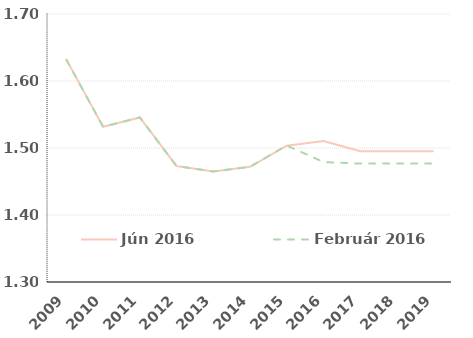
| Category | Jún 2016 | Február 2016 |
|---|---|---|
| 2009.0 | 1.632 | 1.632 |
| 2010.0 | 1.532 | 1.532 |
| 2011.0 | 1.546 | 1.546 |
| 2012.0 | 1.473 | 1.473 |
| 2013.0 | 1.465 | 1.465 |
| 2014.0 | 1.472 | 1.472 |
| 2015.0 | 1.503 | 1.504 |
| 2016.0 | 1.51 | 1.479 |
| 2017.0 | 1.495 | 1.477 |
| 2018.0 | 1.495 | 1.477 |
| 2019.0 | 1.495 | 1.477 |